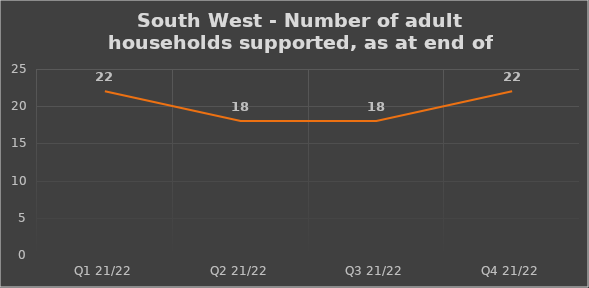
| Category | Number of financially supported households at end of quarter |
|---|---|
| Q1 21/22 | 22 |
| Q2 21/22 | 18 |
| Q3 21/22 | 18 |
| Q4 21/22 | 22 |